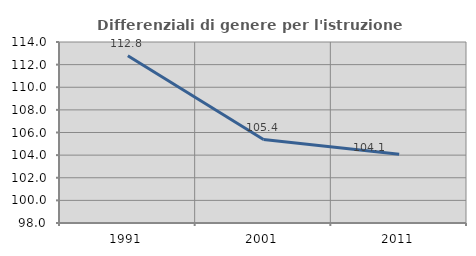
| Category | Differenziali di genere per l'istruzione superiore |
|---|---|
| 1991.0 | 112.783 |
| 2001.0 | 105.381 |
| 2011.0 | 104.068 |